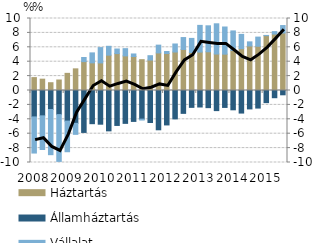
| Category | Háztartás | Államháztartás | Vállalat |
|---|---|---|---|
| 2008.0 | 1.791 | -3.668 | -5.019 |
| 2008.0 | 1.575 | -3.519 | -4.676 |
| 2008.0 | 1.081 | -2.641 | -6.273 |
| 2008.0 | 1.459 | -3.347 | -6.5 |
| 2009.0 | 2.381 | -4.251 | -4.254 |
| 2009.0 | 3.008 | -4.566 | -1.524 |
| 2009.0 | 4.012 | -5.823 | 0.573 |
| 2009.0 | 3.839 | -4.609 | 1.386 |
| 2010.0 | 3.83 | -4.68 | 2.128 |
| 2010.0 | 4.908 | -5.605 | 1.231 |
| 2010.0 | 5.126 | -4.854 | 0.638 |
| 2010.0 | 4.805 | -4.565 | 1.005 |
| 2011.0 | 4.72 | -4.293 | 0.354 |
| 2011.0 | 4.281 | -3.977 | -0.125 |
| 2011.0 | 4.226 | -4.447 | 0.608 |
| 2011.0 | 5.217 | -5.457 | 1.083 |
| 2012.0 | 5.142 | -4.782 | 0.273 |
| 2012.0 | 5.346 | -3.944 | 1.114 |
| 2012.0 | 5.699 | -3.176 | 1.655 |
| 2012.0 | 5.28 | -2.343 | 1.956 |
| 2013.0 | 5.337 | -2.292 | 3.708 |
| 2013.0 | 5.379 | -2.381 | 3.606 |
| 2013.0 | 5.067 | -2.794 | 4.197 |
| 2013.0 | 5.049 | -2.351 | 3.771 |
| 2014.0 | 5.562 | -2.682 | 2.713 |
| 2014.0 | 5.81 | -3.134 | 1.985 |
| 2014.0 | 6.184 | -2.557 | 0.572 |
| 2014.0 | 6.144 | -2.441 | 1.272 |
| 2015.0 | 7.619 | -1.685 | 0.03 |
| 2015.0 | 7.839 | -1.003 | 0.337 |
| 2015.0 | 7.985 | -0.597 | 1.036 |